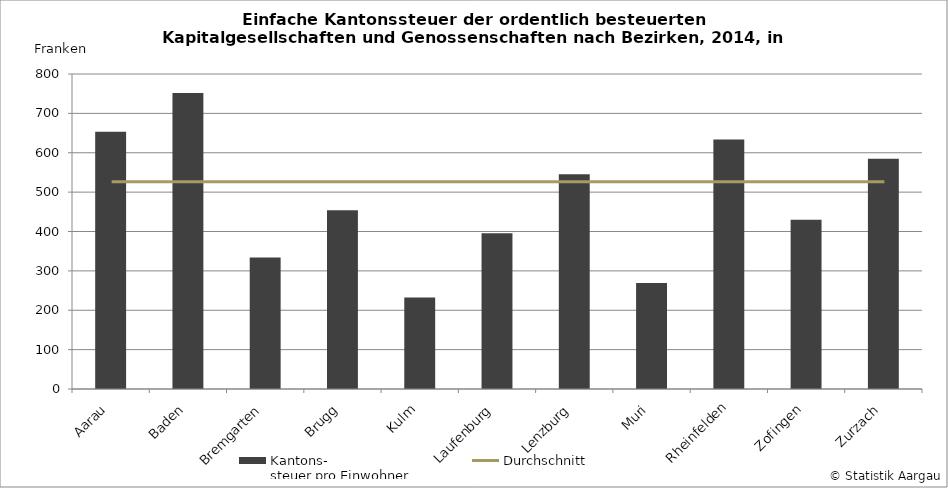
| Category | Kantons-
steuer pro Einwohner |
|---|---|
| Aarau | 653.514 |
| Baden | 751.671 |
| Bremgarten | 333.712 |
| Brugg | 453.655 |
| Kulm | 232.626 |
| Laufenburg | 395.542 |
| Lenzburg | 545.377 |
| Muri | 268.9 |
| Rheinfelden | 633.808 |
| Zofingen | 429.934 |
| Zurzach | 584.811 |